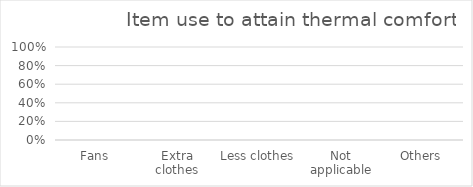
| Category | Series 0 |
|---|---|
| Fans | 0 |
| Extra clothes | 0 |
| Less clothes | 0 |
| Not applicable | 0 |
| Others | 0 |